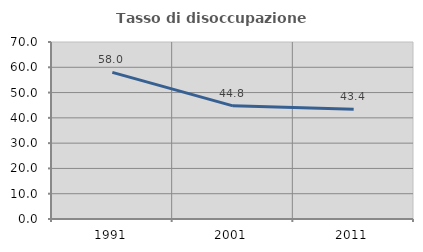
| Category | Tasso di disoccupazione giovanile  |
|---|---|
| 1991.0 | 57.997 |
| 2001.0 | 44.751 |
| 2011.0 | 43.449 |